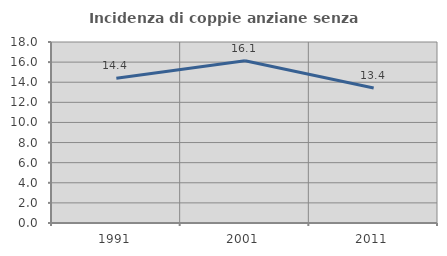
| Category | Incidenza di coppie anziane senza figli  |
|---|---|
| 1991.0 | 14.394 |
| 2001.0 | 16.129 |
| 2011.0 | 13.433 |